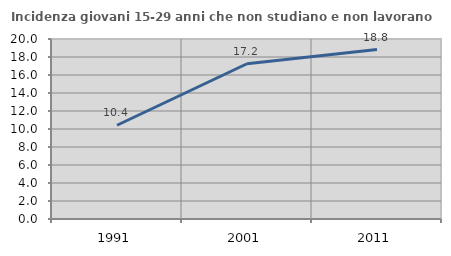
| Category | Incidenza giovani 15-29 anni che non studiano e non lavorano  |
|---|---|
| 1991.0 | 10.415 |
| 2001.0 | 17.25 |
| 2011.0 | 18.825 |